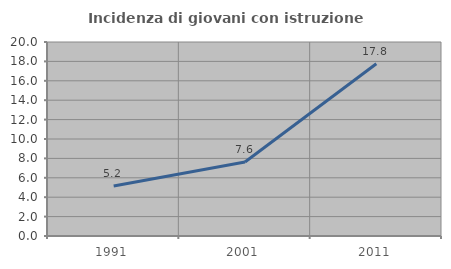
| Category | Incidenza di giovani con istruzione universitaria |
|---|---|
| 1991.0 | 5.152 |
| 2001.0 | 7.629 |
| 2011.0 | 17.754 |